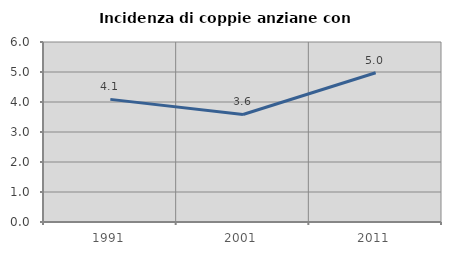
| Category | Incidenza di coppie anziane con figli |
|---|---|
| 1991.0 | 4.087 |
| 2001.0 | 3.584 |
| 2011.0 | 4.975 |